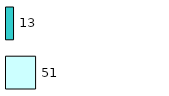
| Category | Series 0 | Series 1 |
|---|---|---|
| 0 | 51 | 13 |